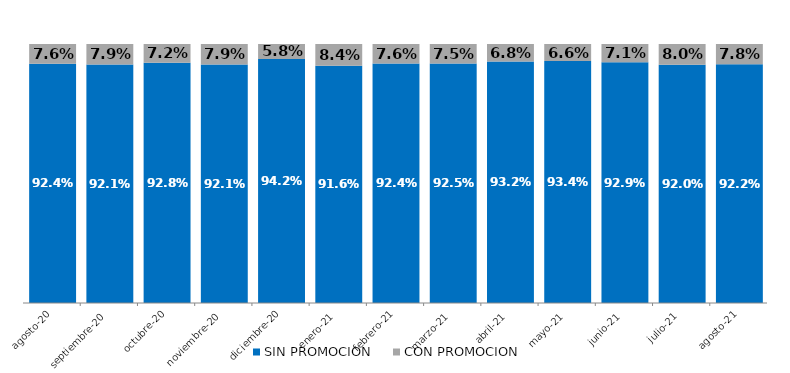
| Category | SIN PROMOCION   | CON PROMOCION   |
|---|---|---|
| 2020-08-01 | 0.924 | 0.076 |
| 2020-09-01 | 0.921 | 0.079 |
| 2020-10-01 | 0.928 | 0.072 |
| 2020-11-01 | 0.921 | 0.079 |
| 2020-12-01 | 0.942 | 0.058 |
| 2021-01-01 | 0.916 | 0.084 |
| 2021-02-01 | 0.924 | 0.076 |
| 2021-03-01 | 0.925 | 0.075 |
| 2021-04-01 | 0.932 | 0.068 |
| 2021-05-01 | 0.934 | 0.066 |
| 2021-06-01 | 0.929 | 0.071 |
| 2021-07-01 | 0.92 | 0.08 |
| 2021-08-01 | 0.922 | 0.078 |